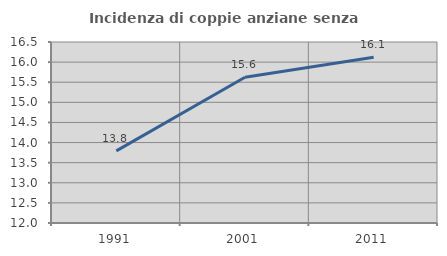
| Category | Incidenza di coppie anziane senza figli  |
|---|---|
| 1991.0 | 13.793 |
| 2001.0 | 15.622 |
| 2011.0 | 16.123 |